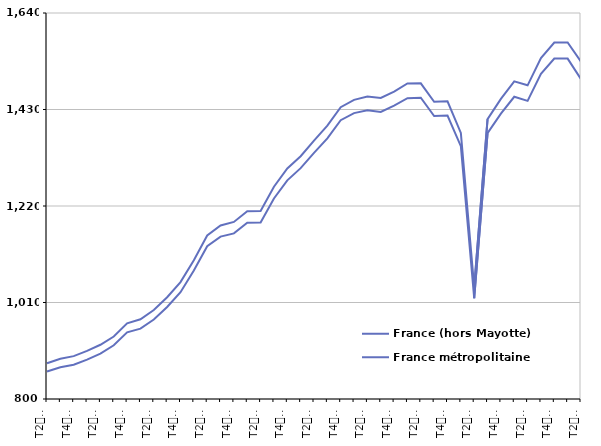
| Category | France (hors Mayotte) | France métropolitaine |
|---|---|---|
| T2
2012 | 877.7 | 859.7 |
| T3
2012 | 887.6 | 869.1 |
| T4
2012 | 893.3 | 874.5 |
| T1
2013 | 904.7 | 885.8 |
| T2
2013 | 918 | 898.9 |
| T3
2013 | 935.9 | 916.8 |
| T4
2013 | 964.6 | 945 |
| T1
2014 | 973.4 | 953.1 |
| T2
2014 | 993.6 | 972.9 |
| T3
2014 | 1021.5 | 1000.3 |
| T4
2014 | 1054.4 | 1032.4 |
| T1
2015 | 1102.1 | 1079.7 |
| T2
2015 | 1155.9 | 1132.3 |
| T3
2015 | 1177.6 | 1153.3 |
| T4
2015 | 1185.3 | 1160.4 |
| T1
2016 | 1208.6 | 1183.5 |
| T2
2016 | 1209.2 | 1184.3 |
| T3
2016 | 1262 | 1236.4 |
| T4
2016 | 1301.6 | 1275.9 |
| T1
2017 | 1328.3 | 1302.4 |
| T2
2017 | 1362.4 | 1335.7 |
| T3
2017 | 1394.8 | 1367.2 |
| T4
2017 | 1435.1 | 1406.7 |
| T1
2018 | 1450.9 | 1422.1 |
| T2
2018 | 1458.3 | 1428.3 |
| T3
2018 | 1455.2 | 1424.7 |
| T4
2018 | 1469.1 | 1438.5 |
| T1
2019 | 1486.6 | 1454.6 |
| T2
2019 | 1486.9 | 1455.5 |
| T3
2019 | 1446.8 | 1415.9 |
| T4
2019 | 1447.7 | 1416.9 |
| T1
2020 | 1379 | 1350.1 |
| T2
2020 | 1043 | 1019.3 |
| T3
2020 | 1409.1 | 1378.7 |
| T4
2020 | 1453.2 | 1421 |
| T1
2021 | 1491.2 | 1457.7 |
| T2
2021 | 1482.6 | 1448.8 |
| T3
2021 | 1541.8 | 1507.5 |
| T4
2021 | 1575.7 | 1541 |
| T1
2022 | 1575.8 | 1540.8 |
| T2
2022 | 1533.9 | 1496.2 |